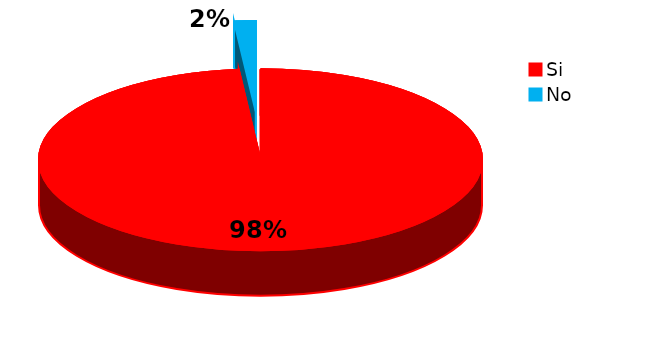
| Category | Series 0 |
|---|---|
| Si | 126 |
| No | 2 |